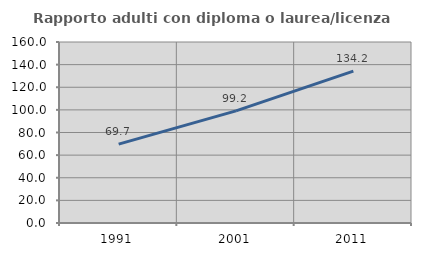
| Category | Rapporto adulti con diploma o laurea/licenza media  |
|---|---|
| 1991.0 | 69.71 |
| 2001.0 | 99.152 |
| 2011.0 | 134.249 |